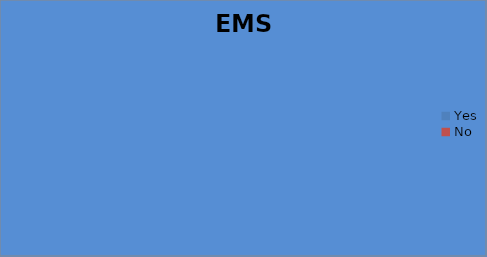
| Category | EMS Defib |
|---|---|
| Yes | 0 |
| No | 0 |